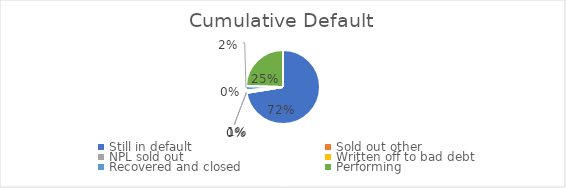
| Category | Series 0 |
|---|---|
| Still in default | 0.724 |
| Sold out other | 0 |
| NPL sold out | 0.008 |
| Written off to bad debt | 0.003 |
| Recovered and closed | 0.019 |
| Performing | 0.246 |